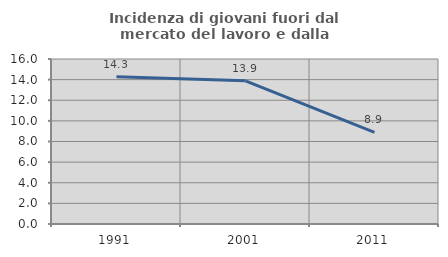
| Category | Incidenza di giovani fuori dal mercato del lavoro e dalla formazione  |
|---|---|
| 1991.0 | 14.286 |
| 2001.0 | 13.889 |
| 2011.0 | 8.889 |